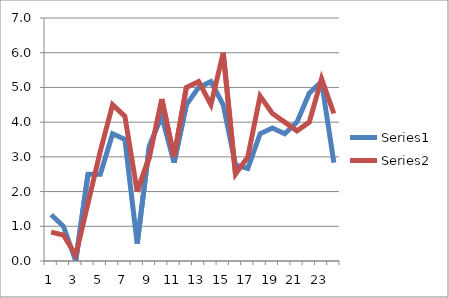
| Category | Series 0 | Series 1 |
|---|---|---|
| 0 | 1.333 | 0.833 |
| 1 | 1 | 0.75 |
| 2 | 0 | 0.167 |
| 3 | 2.5 | 1.667 |
| 4 | 2.5 | 3.167 |
| 5 | 3.667 | 4.5 |
| 6 | 3.5 | 4.167 |
| 7 | 0.5 | 2 |
| 8 | 3.333 | 3 |
| 9 | 4.167 | 4.667 |
| 10 | 2.833 | 3 |
| 11 | 4.5 | 5 |
| 12 | 5 | 5.167 |
| 13 | 5.167 | 4.5 |
| 14 | 4.5 | 6 |
| 15 | 2.767 | 2.5 |
| 16 | 2.667 | 3 |
| 17 | 3.667 | 4.75 |
| 18 | 3.833 | 4.25 |
| 19 | 3.667 | 4 |
| 20 | 4 | 3.75 |
| 21 | 4.833 | 4 |
| 22 | 5.167 | 5.25 |
| 23 | 2.833 | 4.25 |